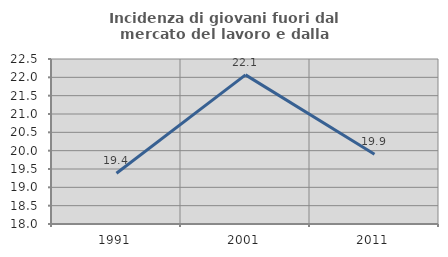
| Category | Incidenza di giovani fuori dal mercato del lavoro e dalla formazione  |
|---|---|
| 1991.0 | 19.383 |
| 2001.0 | 22.067 |
| 2011.0 | 19.901 |